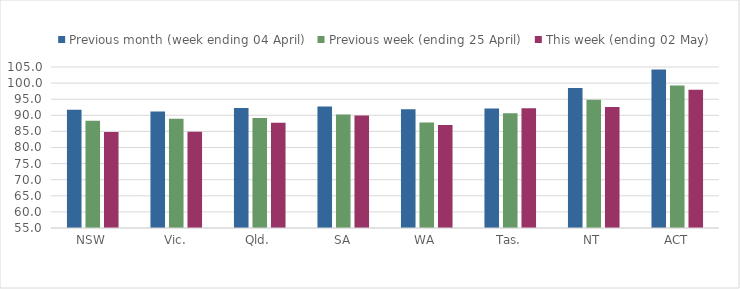
| Category | Previous month (week ending 04 April) | Previous week (ending 25 April) | This week (ending 02 May) |
|---|---|---|---|
| NSW | 91.733 | 88.318 | 84.822 |
| Vic. | 91.154 | 88.952 | 84.925 |
| Qld. | 92.303 | 89.178 | 87.664 |
| SA | 92.751 | 90.241 | 89.938 |
| WA | 91.901 | 87.789 | 86.999 |
| Tas. | 92.102 | 90.611 | 92.226 |
| NT | 98.5 | 94.844 | 92.583 |
| ACT | 104.211 | 99.237 | 97.954 |